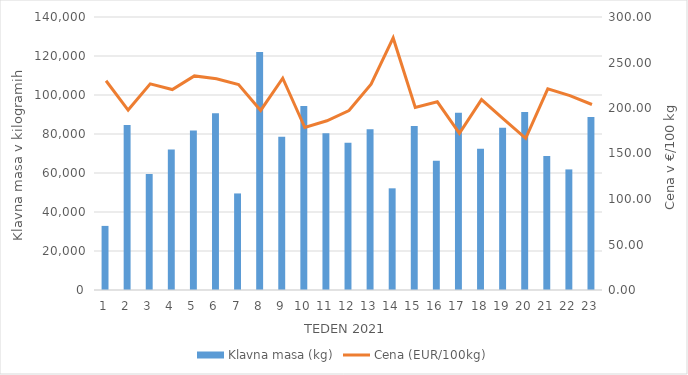
| Category | Klavna masa (kg) |
|---|---|
| 1.0 | 32871 |
| 2.0 | 84639 |
| 3.0 | 59476 |
| 4.0 | 72013 |
| 5.0 | 81759 |
| 6.0 | 90669 |
| 7.0 | 49517 |
| 8.0 | 122111 |
| 9.0 | 78545 |
| 10.0 | 94384 |
| 11.0 | 80405 |
| 12.0 | 75534 |
| 13.0 | 82440 |
| 14.0 | 52143 |
| 15.0 | 84105 |
| 16.0 | 66298 |
| 17.0 | 90925 |
| 18.0 | 72394 |
| 19.0 | 83193 |
| 20.0 | 91231 |
| 21.0 | 68763 |
| 22.0 | 61837 |
| 23.0 | 88747 |